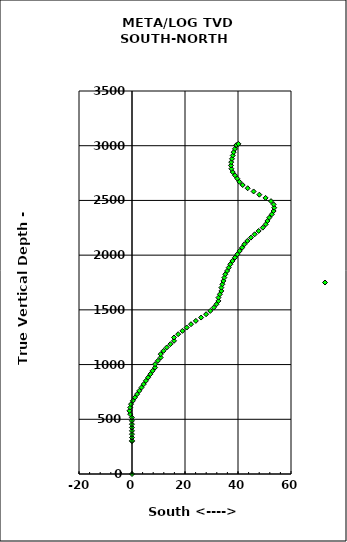
| Category | Series 0 |
|---|---|
| 0.0 | 0 |
| 0.0 | 300.639 |
| -0.005784569404453351 | 303.064 |
| -0.011569138808906702 | 333.539 |
| -0.017353708213360054 | 364.014 |
| -0.023138277617813407 | 394.49 |
| -0.02892284702226676 | 424.965 |
| -0.03470741642672011 | 455.44 |
| -0.04049198583117346 | 485.916 |
| -0.04627655523562681 | 516.391 |
| -0.6832579787643637 | 546.866 |
| -0.9700391874138055 | 577.343 |
| -0.6619345646988615 | 607.827 |
| -0.3538299419839175 | 638.292 |
| 0.32751244016875825 | 668.758 |
| 1.0929023100432589 | 699.224 |
| 1.9255515745889666 | 729.683 |
| 2.758200839134674 | 760.141 |
| 3.5908501036803817 | 790.599 |
| 4.423499368226089 | 821.058 |
| 5.256148632771797 | 851.516 |
| 6.088797897317505 | 881.974 |
| 6.929049024056561 | 912.432 |
| 7.769300150795617 | 942.883 |
| 8.714925929906858 | 973.334 |
| 8.714925929906858 | 1003.783 |
| 9.771974637283652 | 1034.222 |
| 10.829023344660445 | 1064.68 |
| 10.829023344660445 | 1095.137 |
| 11.905907024206233 | 1125.577 |
| 13.107181699835468 | 1156.013 |
| 14.478263277112815 | 1186.439 |
| 15.84934485439016 | 1216.844 |
| 15.84934485439016 | 1247.249 |
| 17.419252061492536 | 1277.666 |
| 19.034038476386456 | 1308.072 |
| 20.648824891280377 | 1338.465 |
| 22.258864569221334 | 1368.858 |
| 24.095105497624097 | 1399.245 |
| 26.076336695288433 | 1429.618 |
| 27.9628122034621 | 1459.981 |
| 29.535597272294357 | 1490.349 |
| 30.849699700699347 | 1520.727 |
| 31.867632095985808 | 1551.125 |
| 32.618363232029665 | 1581.536 |
| 32.618363232029665 | 1611.965 |
| 33.17133335197626 | 1642.398 |
| 33.72430347192285 | 1672.841 |
| 33.72430347192285 | 1703.284 |
| 34.1042764897314 | 1733.742 |
| 34.48424950753994 | 1764.202 |
| 34.851052826512905 | 1794.662 |
| 35.21785614548587 | 1825.13 |
| 35.90190570441963 | 1855.599 |
| 36.50198968641741 | 1886.049 |
| 37.10207366841519 | 1916.518 |
| 37.90733994349574 | 1946.986 |
| 38.83323554105896 | 1977.437 |
| 39.743017944099485 | 2007.885 |
| 40.65280034714001 | 2038.345 |
| 41.56258275018053 | 2068.805 |
| 42.42016068322085 | 2099.266 |
| 43.52833781072629 | 2129.714 |
| 44.871839338244584 | 2160.151 |
| 46.29066109318176 | 2190.578 |
| 47.79414543096966 | 2220.989 |
| 49.35548317465444 | 2251.406 |
| 50.46662835773504 | 2281.836 |
| 51.09968492947626 | 2312.285 |
| 51.81418410034453 | 2342.721 |
| 52.77067828924344 | 2373.1 |
| 53.441800598768246 | 2403.391 |
| 53.669048747036534 | 2433.564 |
| 53.45529110378863 | 2463.593 |
| 52.45889737120938 | 2493.448 |
| 50.40574078898484 | 2523.071 |
| 48.05239135461215 | 2552.497 |
| 45.895764555042355 | 2581.892 |
| 43.65496058264725 | 2611.295 |
| 41.773849020543075 | 2640.644 |
| 40.53021265313427 | 2670.039 |
| 39.72988482508861 | 2699.568 |
| 38.861480705427844 | 2729.33 |
| 37.99561700493663 | 2759.35 |
| 37.5148698010305 | 2789.519 |
| 37.362193494390496 | 2819.745 |
| 37.441946954067895 | 2850.024 |
| 37.738333924113185 | 2880.354 |
| 38.034720894158475 | 2910.707 |
| 38.36167896479723 | 2941.06 |
| 38.848160418886785 | 2971.399 |
| 39.33464187297634 | 3001.699 |
| 39.37164973634222 | 3005.94 |
| 40.162471723656594 | 3016.847 |